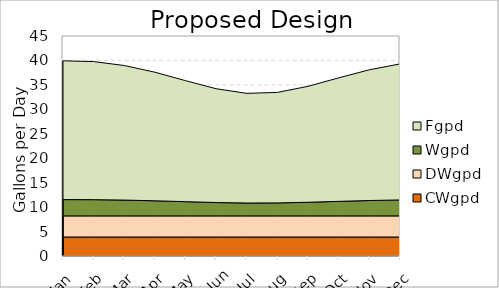
| Category | CWgpd | DWgpd | Wgpd | Fgpd |
|---|---|---|---|---|
| Jan | 3.889 | 4.317 | 3.334 | 28.388 |
| Feb | 3.889 | 4.317 | 3.317 | 28.242 |
| Mar | 3.889 | 4.317 | 3.233 | 27.525 |
| Apr | 3.889 | 4.317 | 3.089 | 26.299 |
| May | 3.889 | 4.317 | 2.907 | 24.751 |
| Jun | 3.889 | 4.317 | 2.734 | 23.276 |
| Jul | 3.889 | 4.317 | 2.634 | 22.427 |
| Aug | 3.889 | 4.317 | 2.654 | 22.602 |
| Sep | 3.889 | 4.317 | 2.785 | 23.715 |
| Oct | 3.889 | 4.317 | 2.967 | 25.268 |
| Nov | 3.889 | 4.317 | 3.141 | 26.742 |
| Dec | 3.889 | 4.317 | 3.267 | 27.817 |